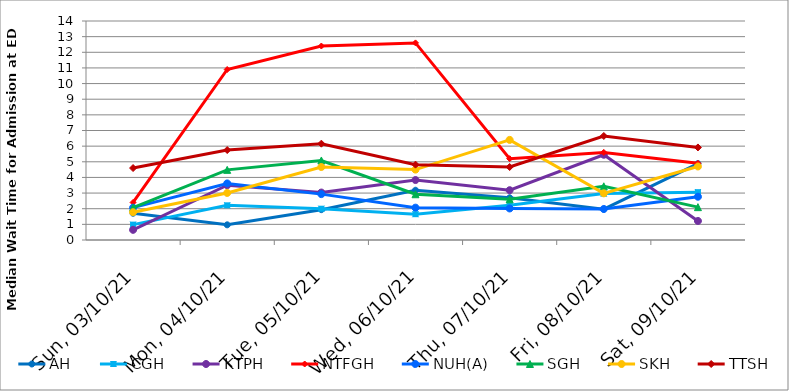
| Category | AH | CGH | KTPH | NTFGH | NUH(A) | SGH | SKH | TTSH |
|---|---|---|---|---|---|---|---|---|
| 2021-10-03 | 1.71 | 0.983 | 0.65 | 2.4 | 2.067 | 2.067 | 1.775 | 4.6 |
| 2021-10-04 | 0.97 | 2.217 | 3.5 | 10.9 | 3.617 | 4.483 | 3.008 | 5.75 |
| 2021-10-05 | 1.94 | 2 | 3.033 | 12.4 | 2.933 | 5.083 | 4.667 | 6.158 |
| 2021-10-06 | 3.18 | 1.65 | 3.833 | 12.6 | 2.067 | 2.925 | 4.5 | 4.817 |
| 2021-10-07 | 2.7 | 2.217 | 3.183 | 5.2 | 2.017 | 2.6 | 6.4 | 4.667 |
| 2021-10-08 | 1.97 | 2.967 | 5.45 | 5.6 | 1.983 | 3.433 | 2.983 | 6.65 |
| 2021-10-09 | 4.88 | 3.058 | 1.217 | 4.9 | 2.767 | 2.1 | 4.7 | 5.917 |